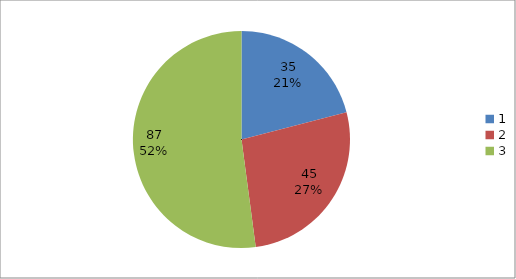
| Category | Series 0 |
|---|---|
| 0 | 35 |
| 1 | 45 |
| 2 | 87 |